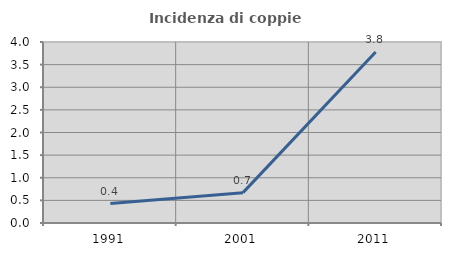
| Category | Incidenza di coppie miste |
|---|---|
| 1991.0 | 0.429 |
| 2001.0 | 0.671 |
| 2011.0 | 3.779 |